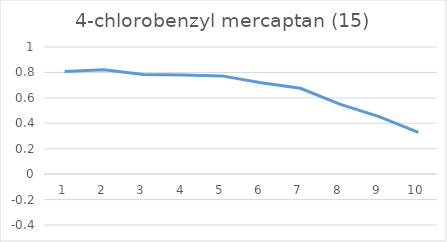
| Category | Series 0 |
|---|---|
| 0 | 0.806 |
| 1 | 0.821 |
| 2 | 0.784 |
| 3 | 0.779 |
| 4 | 0.773 |
| 5 | 0.718 |
| 6 | 0.675 |
| 7 | 0.551 |
| 8 | 0.452 |
| 9 | 0.328 |